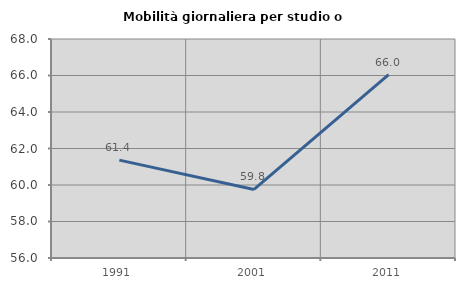
| Category | Mobilità giornaliera per studio o lavoro |
|---|---|
| 1991.0 | 61.364 |
| 2001.0 | 59.754 |
| 2011.0 | 66.042 |